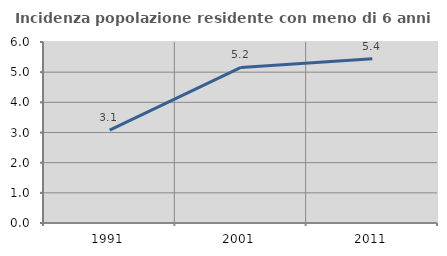
| Category | Incidenza popolazione residente con meno di 6 anni |
|---|---|
| 1991.0 | 3.082 |
| 2001.0 | 5.156 |
| 2011.0 | 5.441 |